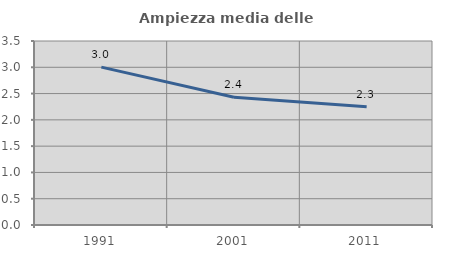
| Category | Ampiezza media delle famiglie |
|---|---|
| 1991.0 | 3.003 |
| 2001.0 | 2.43 |
| 2011.0 | 2.251 |